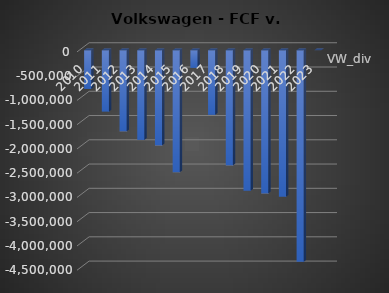
| Category | VW_div | VW_FCF |
|---|---|---|
| 2010.0 | -798000 |  |
| 2011.0 | -1266000 |  |
| 2012.0 | -1673000 |  |
| 2013.0 | -1849000 |  |
| 2014.0 | -1962000 |  |
| 2015.0 | -2516000 |  |
| 2016.0 | -364000 |  |
| 2017.0 | -1332000 |  |
| 2018.0 | -2375000 |  |
| 2019.0 | -2899000 |  |
| 2020.0 | -2952000 |  |
| 2021.0 | -3022000 |  |
| 2022.0 | -4362000 |  |
| 2023.0 | 0 |  |